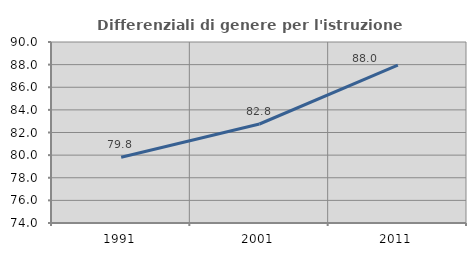
| Category | Differenziali di genere per l'istruzione superiore |
|---|---|
| 1991.0 | 79.806 |
| 2001.0 | 82.751 |
| 2011.0 | 87.956 |